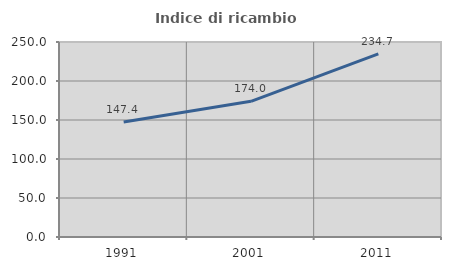
| Category | Indice di ricambio occupazionale  |
|---|---|
| 1991.0 | 147.426 |
| 2001.0 | 173.98 |
| 2011.0 | 234.658 |